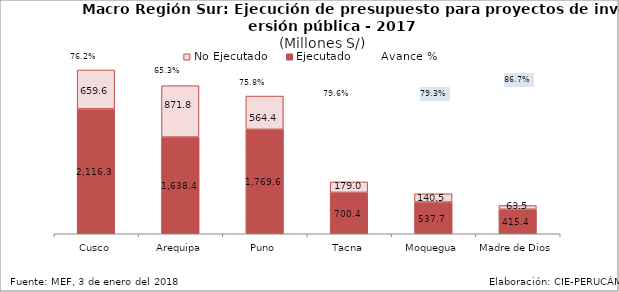
| Category | Ejecutado | No Ejecutado |
|---|---|---|
| Cusco | 2116.257 | 659.622 |
| Arequipa | 1638.394 | 871.834 |
| Puno | 1769.592 | 564.432 |
| Tacna | 700.406 | 178.963 |
| Moquegua | 537.724 | 140.532 |
| Madre de Dios | 415.39 | 63.503 |